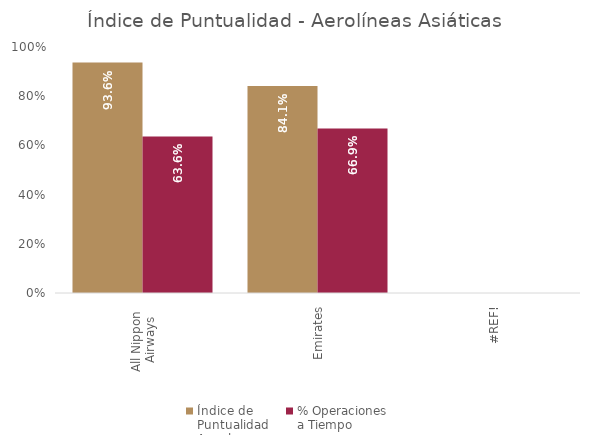
| Category | Índice de 
Puntualidad
Anual | % Operaciones 
a Tiempo |
|---|---|---|
| All Nippon 
Airways | 0.936 | 0.636 |
| Emirates | 0.841 | 0.669 |
| #¡REF! | 0 | 0 |